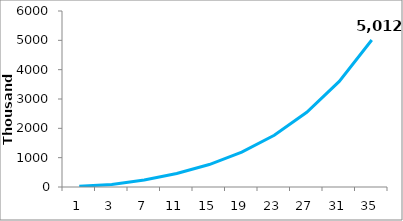
| Category | Series 1 |
|---|---|
| 1.0 | 25500 |
| 3.0 | 84351.45 |
| 7.0 | 239641.102 |
| 11.0 | 459394.027 |
| 15.0 | 765678.379 |
| 19.0 | 1187676.195 |
| 23.0 | 1763926.387 |
| 27.0 | 2545268.873 |
| 31.0 | 3598708.251 |
| 35.0 | 5012483.382 |